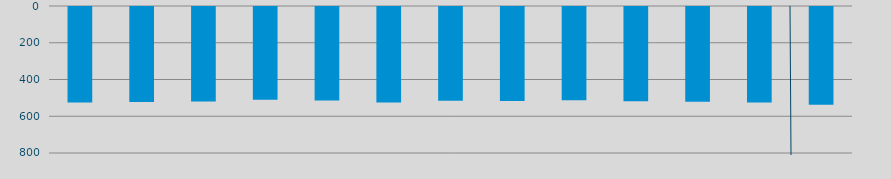
| Category | Energía a bajar | Energía a subir |
|---|---|---|
| E | 520.032 |  |
| F | 516.897 |  |
| M | 513.61 |  |
| A | 504.985 |  |
| M | 508.805 |  |
| J | 519.464 |  |
| J | 510.745 |  |
| A | 512.124 |  |
| S | 507.342 |  |
| O | 513.588 |  |
| N | 515.549 |  |
| D | 519.921 |  |
| E | 531.331 |  |